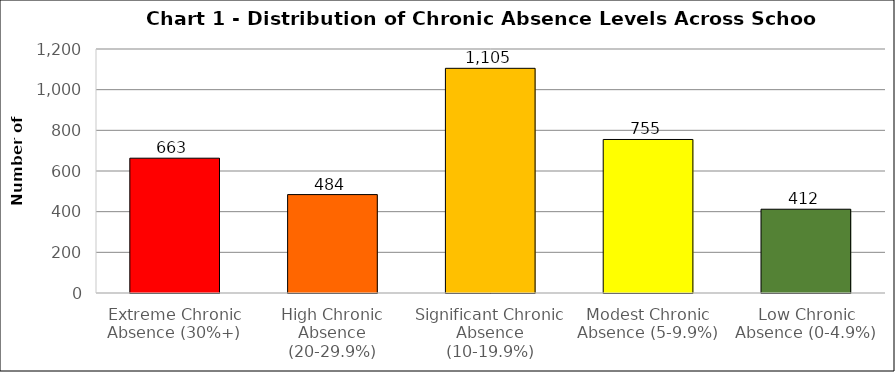
| Category | Series 0 |
|---|---|
| Extreme Chronic Absence (30%+) | 663 |
| High Chronic Absence (20-29.9%) | 484 |
| Significant Chronic Absence (10-19.9%) | 1105 |
| Modest Chronic Absence (5-9.9%) | 755 |
| Low Chronic Absence (0-4.9%) | 412 |